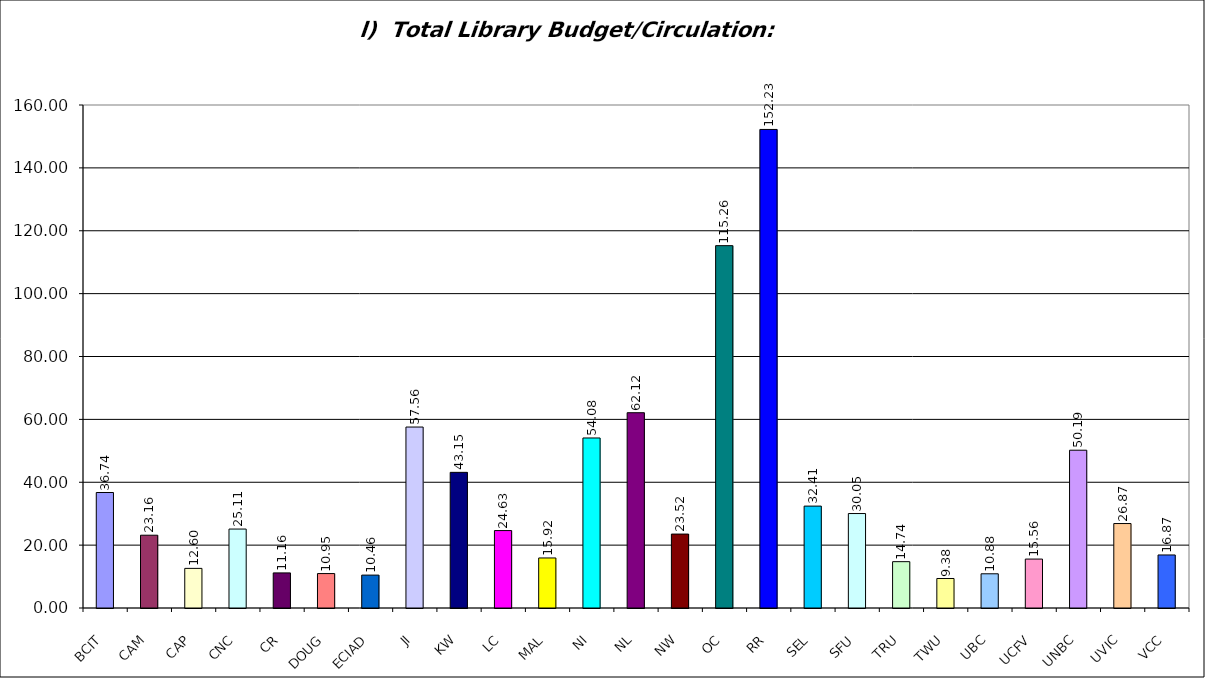
| Category | l)  Total Library Budget/Circulation:  7(l)/6(d) |
|---|---|
| BCIT | 36.735 |
| CAM | 23.155 |
| CAP | 12.602 |
| CNC | 25.11 |
| CR | 11.159 |
| DOUG | 10.951 |
| ECIAD | 10.464 |
| JI | 57.561 |
| KW | 43.151 |
| LC | 24.628 |
| MAL | 15.917 |
| NI | 54.082 |
| NL | 62.122 |
| NW | 23.516 |
| OC | 115.259 |
| RR | 152.225 |
| SEL | 32.415 |
| SFU | 30.05 |
| TRU | 14.738 |
| TWU | 9.384 |
| UBC | 10.88 |
| UCFV | 15.562 |
| UNBC | 50.192 |
| UVIC | 26.865 |
| VCC | 16.87 |